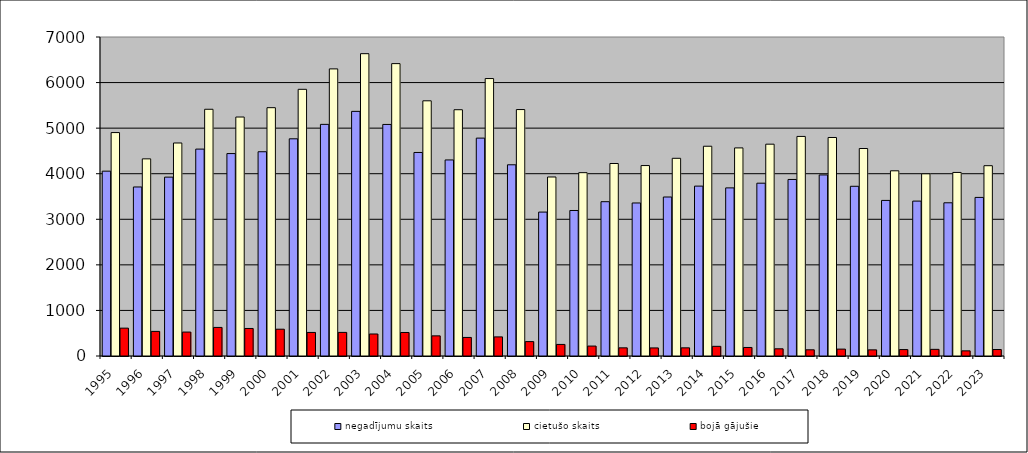
| Category | negadījumu skaits | cietušo skaits | bojā gājušie |
|---|---|---|---|
| 1995.0 | 4056 | 4903 | 611 |
| 1996.0 | 3709 | 4326 | 540 |
| 1997.0 | 3925 | 4674 | 525 |
| 1998.0 | 4540 | 5414 | 627 |
| 1999.0 | 4442 | 5244 | 604 |
| 2000.0 | 4482 | 5449 | 588 |
| 2001.0 | 4766 | 5852 | 517 |
| 2002.0 | 5083 | 6300 | 518 |
| 2003.0 | 5368 | 6634 | 483 |
| 2004.0 | 5081 | 6416 | 516 |
| 2005.0 | 4466 | 5600 | 442 |
| 2006.0 | 4302 | 5404 | 407 |
| 2007.0 | 4781 | 6088 | 419 |
| 2008.0 | 4196 | 5408 | 316 |
| 2009.0 | 3158 | 3928 | 254 |
| 2010.0 | 3193 | 4023 | 218 |
| 2011.0 | 3386 | 4224 | 179 |
| 2012.0 | 3358 | 4179 | 177 |
| 2013.0 | 3489 | 4338 | 179 |
| 2014.0 | 3728 | 4603 | 212 |
| 2015.0 | 3689 | 4566 | 187 |
| 2016.0 | 3792 | 4648 | 158 |
| 2017.0 | 3874 | 4818 | 136 |
| 2018.0 | 3973 | 4795 | 151 |
| 2019.0 | 3724 | 4553 | 135 |
| 2020.0 | 3414 | 4064 | 141 |
| 2021.0 | 3399 | 3998 | 146 |
| 2022.0 | 3362 | 4028 | 113 |
| 2023.0 | 3480 | 4176 | 142 |